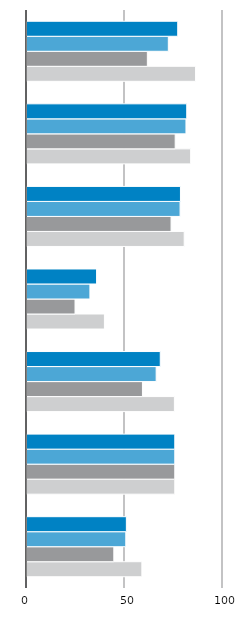
| Category | Summe von Maximum | Summe von Minimum | Summe von Deutschland | Summe von Anteil an den Beschäftigten insg. In % wB |
|---|---|---|---|---|
| 7 | 58.6 | 44.3 | 50.4 | 50.7 |
| 6 | 75.4 | 75.4 | 75.4 | 75.4 |
| 5 | 75.2 | 58.9 | 65.9 | 68 |
| 4 | 39.5 | 24.5 | 32.1 | 35.5 |
| 3 | 80.2 | 73.5 | 78.1 | 78.3 |
| 2 | 83.5 | 75.6 | 81.1 | 81.5 |
| 1 | 86 | 61.4 | 72.1 | 76.9 |